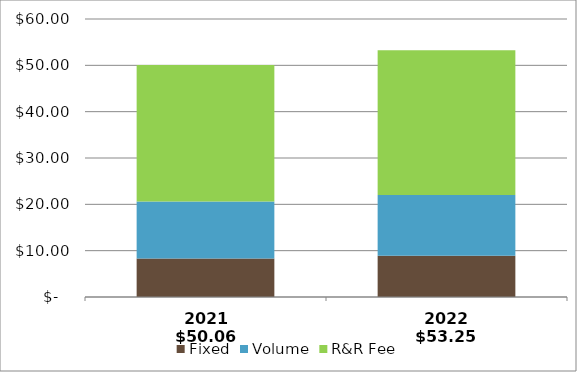
| Category | Fixed | Volume | R&R Fee |
|---|---|---|---|
| 2021 $50.06 | 8.3 | 12.32 | 29.44 |
| 2022 $53.25 | 8.88 | 13.16 | 31.21 |